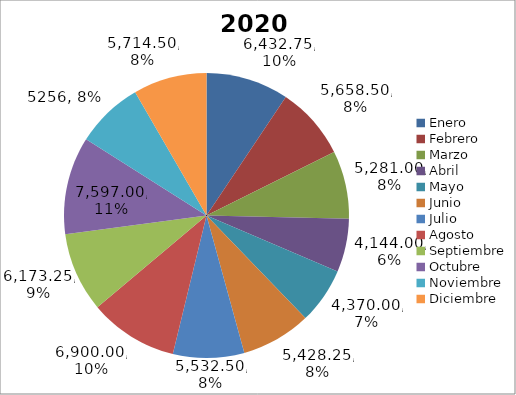
| Category | Año 2020 Valor $ | Año 2020 Toneladas |
|---|---|---|
| Enero | 6432.75 | 257.31 |
| Febrero | 5658.5 | 226.34 |
| Marzo | 5281 | 211.24 |
| Abril | 4144 | 165.76 |
| Mayo | 4370 | 174.8 |
| Junio | 5428.25 | 217.13 |
| Julio | 5532.5 | 221.3 |
| Agosto | 6900 | 276 |
| Septiembre | 6173.25 | 246.93 |
| Octubre | 7597 | 303.88 |
| Noviembre | 5256 | 210.24 |
| Diciembre | 5714.5 | 228.58 |